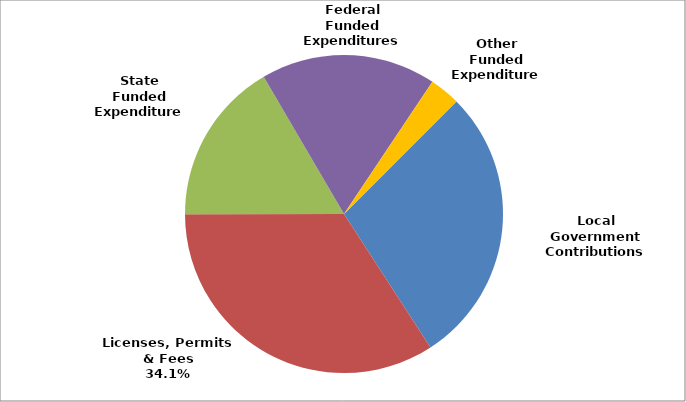
| Category | Series 0 |
|---|---|
| Local Government Contributions | 0.283 |
| Licenses, Permits & Fees | 0.341 |
| State Funded Expenditures | 0.166 |
| Federal Funded Expenditures | 0.178 |
| Other Funded Expenditures | 0.031 |